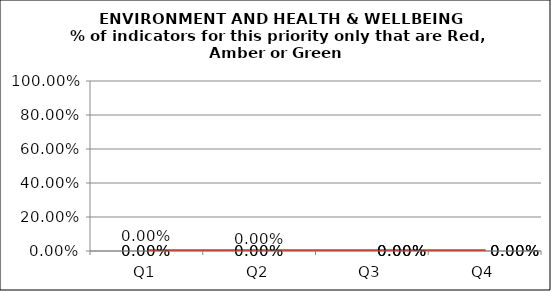
| Category | Green | Amber | Red |
|---|---|---|---|
| Q1 | 0 | 0 | 0 |
| Q2 | 0 | 0 | 0 |
| Q3 | 0 | 0 | 0 |
| Q4 | 0 | 0 | 0 |